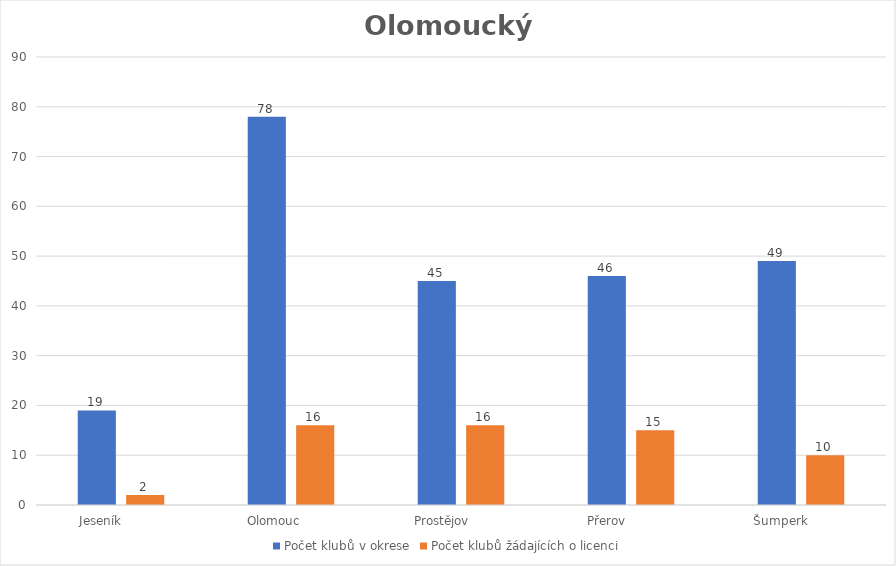
| Category | Počet klubů v okrese | Počet klubů žádajících o licenci |
|---|---|---|
| Jeseník           | 19 | 2 |
| Olomouc         | 78 | 16 |
| Prostějov          | 45 | 16 |
| Přerov             | 46 | 15 |
| Šumperk           | 49 | 10 |